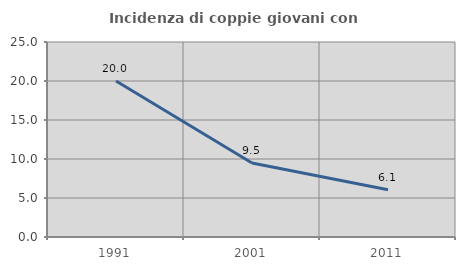
| Category | Incidenza di coppie giovani con figli |
|---|---|
| 1991.0 | 20 |
| 2001.0 | 9.491 |
| 2011.0 | 6.061 |